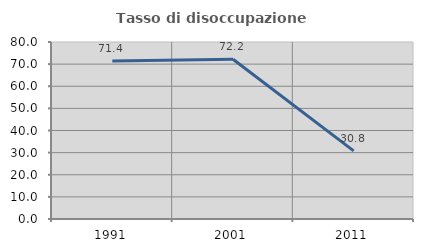
| Category | Tasso di disoccupazione giovanile  |
|---|---|
| 1991.0 | 71.429 |
| 2001.0 | 72.222 |
| 2011.0 | 30.769 |